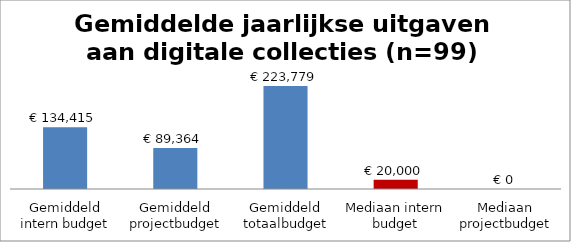
| Category | Series 0 |
|---|---|
| Gemiddeld intern budget | 134415 |
| Gemiddeld projectbudget | 89364 |
| Gemiddeld totaalbudget | 223779 |
| Mediaan intern budget | 20000 |
| Mediaan projectbudget | 0 |